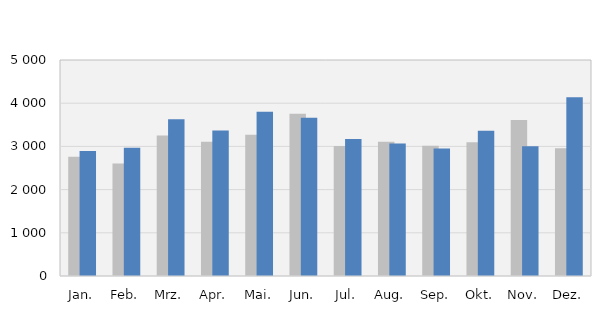
| Category | 2018 | 2019 |
|---|---|---|
| Jan. | 2759 | 2894 |
| Feb. | 2604 | 2967 |
| Mrz. | 3253 | 3626 |
| Apr. | 3106 | 3367 |
| Mai. | 3269 | 3802 |
| Jun. | 3756 | 3661 |
| Jul. | 3007 | 3171 |
| Aug. | 3108 | 3067 |
| Sep. | 3013 | 2950 |
| Okt. | 3098 | 3361 |
| Nov. | 3609 | 3004 |
| Dez. | 2956 | 4138 |